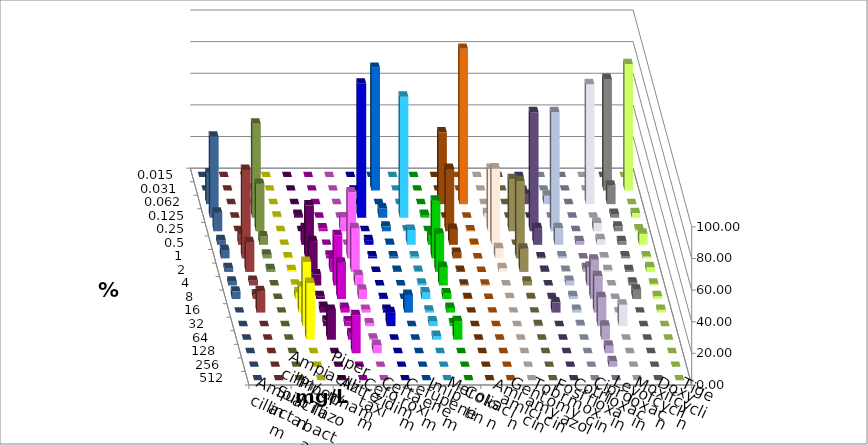
| Category | Ampicillin | Ampicillin/ Sulbactam | Piperacillin | Piperacillin/ Tazobactam | Aztreonam | Cefotaxim | Ceftazidim | Cefuroxim | Imipenem | Meropenem | Colistin | Amikacin | Gentamicin | Tobramycin | Fosfomycin | Cotrimoxazol | Ciprofloxacin | Levofloxacin | Moxifloxacin | Doxycyclin | Tigecyclin |
|---|---|---|---|---|---|---|---|---|---|---|---|---|---|---|---|---|---|---|---|---|---|
| 0.015 | 0 | 0 | 0 | 0 | 0 | 0 | 0 | 0 | 0 | 0 | 0 | 0 | 0 | 0 | 0 | 0 | 0 | 0 | 0 | 0 | 0 |
| 0.031 | 0 | 0 | 0 | 0 | 0 | 77.647 | 0 | 0 | 0 | 0 | 0 | 0 | 0 | 0 | 0 | 0 | 70.588 | 80 | 0 | 0 | 1.176 |
| 0.062 | 0 | 0 | 0 | 0 | 0 | 0 | 0 | 0 | 45.294 | 98.235 | 0 | 0 | 5.882 | 5.294 | 0 | 75.882 | 11.765 | 0 | 19.412 | 0 | 0 |
| 0.125 | 0.588 | 1.765 | 0 | 0 | 84.706 | 5.882 | 76.471 | 1.765 | 0 | 0 | 2.941 | 0 | 0 | 0 | 0 | 0 | 2.353 | 2.941 | 51.176 | 0 | 59.412 |
| 0.25 | 0 | 0 | 1.765 | 8.824 | 0 | 2.941 | 0.588 | 0 | 39.412 | 0.588 | 39.412 | 32.941 | 75.294 | 75.294 | 0 | 5.294 | 2.941 | 1.176 | 11.765 | 0 | 30 |
| 0.5 | 0 | 10.588 | 0 | 0 | 2.941 | 0.588 | 9.412 | 5.882 | 10 | 0.588 | 48.235 | 0 | 10.588 | 10.588 | 2.367 | 3.529 | 2.353 | 7.059 | 2.941 | 5.882 | 5.294 |
| 1.0 | 0.588 | 33.529 | 1.765 | 41.765 | 1.176 | 1.176 | 1.176 | 36.471 | 3.529 | 0 | 6.471 | 48.824 | 0.588 | 1.176 | 0 | 0.588 | 1.176 | 1.176 | 5.294 | 55.882 | 2.353 |
| 2.0 | 1.176 | 19.412 | 7.647 | 27.647 | 0 | 0.588 | 0.588 | 24.118 | 0.588 | 0 | 2.353 | 14.706 | 0.588 | 0.588 | 2.367 | 1.176 | 1.176 | 2.941 | 2.353 | 18.824 | 1.765 |
| 4.0 | 0.588 | 7.059 | 31.765 | 6.471 | 0 | 0 | 1.176 | 11.765 | 0.588 | 0.588 | 0 | 2.353 | 0 | 2.941 | 11.834 | 0 | 1.765 | 1.176 | 2.353 | 2.941 | 0 |
| 8.0 | 4.118 | 1.765 | 22.941 | 5.882 | 0.588 | 0 | 4.118 | 3.529 | 0.588 | 0 | 0.588 | 0.588 | 0.588 | 1.765 | 24.852 | 0 | 5.882 | 1.765 | 4.706 | 2.941 | 0 |
| 16.0 | 16.471 | 3.529 | 2.941 | 1.765 | 1.765 | 11.176 | 1.176 | 2.941 | 0 | 0 | 0 | 0 | 6.471 | 1.765 | 23.077 | 0 | 0 | 1.765 | 0 | 13.529 | 0 |
| 32.0 | 40.588 | 3.529 | 2.941 | 1.765 | 8.824 | 0 | 2.941 | 1.765 | 0 | 0 | 0 | 0.588 | 0 | 0.588 | 18.343 | 13.529 | 0 | 0 | 0 | 0 | 0 |
| 64.0 | 35.882 | 18.824 | 4.118 | 0.588 | 0 | 0 | 2.353 | 11.765 | 0 | 0 | 0 | 0 | 0 | 0 | 8.876 | 0 | 0 | 0 | 0 | 0 | 0 |
| 128.0 | 0 | 0 | 24.118 | 5.294 | 0 | 0 | 0 | 0 | 0 | 0 | 0 | 0 | 0 | 0 | 4.734 | 0 | 0 | 0 | 0 | 0 | 0 |
| 256.0 | 0 | 0 | 0 | 0 | 0 | 0 | 0 | 0 | 0 | 0 | 0 | 0 | 0 | 0 | 3.55 | 0 | 0 | 0 | 0 | 0 | 0 |
| 512.0 | 0 | 0 | 0 | 0 | 0 | 0 | 0 | 0 | 0 | 0 | 0 | 0 | 0 | 0 | 0 | 0 | 0 | 0 | 0 | 0 | 0 |